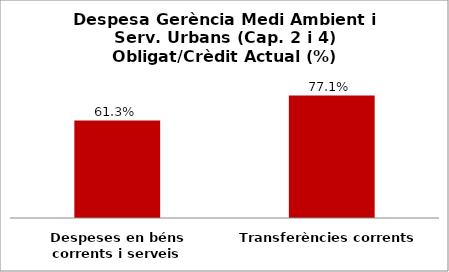
| Category | Series 0 |
|---|---|
| Despeses en béns corrents i serveis | 0.613 |
| Transferències corrents | 0.771 |